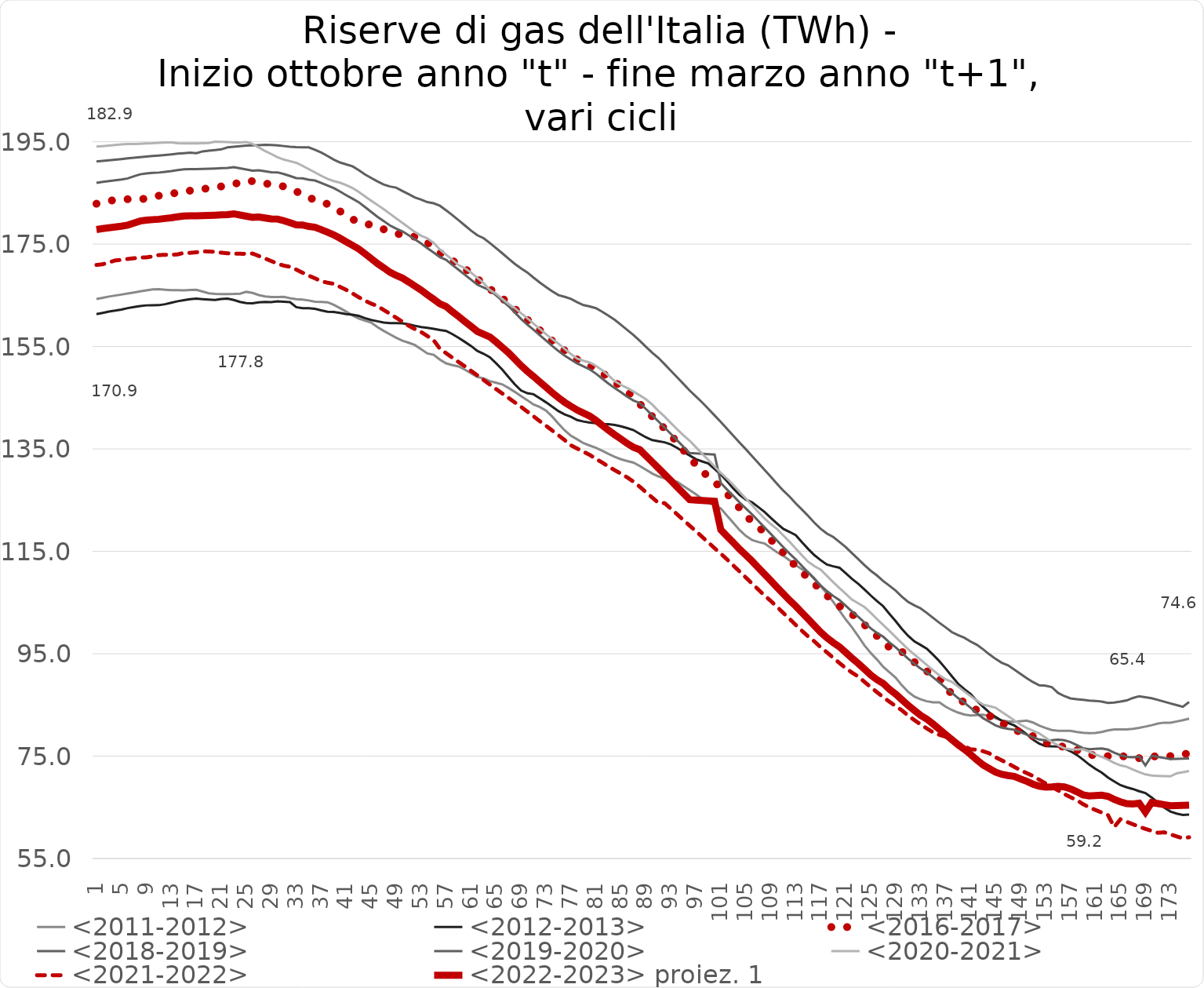
| Category | <2011-2012> | <2012-2013> | <2016-2017> | <2018-2019> | <2019-2020> | <2020-2021> | <2021-2022> | <2022-2023> proiez. 1 |
|---|---|---|---|---|---|---|---|---|
| 1.0 | 164.28 | 161.325 | 182.89 | 186.966 | 191.146 | 194.044 | 170.933 | 177.846 |
| 2.0 | 164.523 | 161.574 | 183.183 | 187.153 | 191.28 | 194.151 | 171.078 | 178.033 |
| 3.0 | 164.768 | 161.839 | 183.434 | 187.307 | 191.392 | 194.264 | 171.438 | 178.187 |
| 4.0 | 164.958 | 162.014 | 183.638 | 187.474 | 191.501 | 194.377 | 171.813 | 178.354 |
| 5.0 | 165.149 | 162.228 | 183.717 | 187.626 | 191.621 | 194.494 | 171.944 | 178.506 |
| 6.0 | 165.348 | 162.505 | 183.777 | 187.833 | 191.754 | 194.574 | 172.102 | 178.713 |
| 7.0 | 165.545 | 162.725 | 183.762 | 188.248 | 191.89 | 194.576 | 172.243 | 179.128 |
| 8.0 | 165.768 | 162.892 | 183.729 | 188.643 | 192 | 194.606 | 172.367 | 179.523 |
| 9.0 | 165.968 | 163.041 | 183.946 | 188.816 | 192.115 | 194.661 | 172.42 | 179.695 |
| 10.0 | 166.179 | 163.072 | 184.252 | 188.909 | 192.208 | 194.707 | 172.601 | 179.789 |
| 11.0 | 166.21 | 163.081 | 184.461 | 188.983 | 192.298 | 194.791 | 172.871 | 179.863 |
| 12.0 | 166.105 | 163.273 | 184.693 | 189.134 | 192.412 | 194.88 | 172.916 | 180.014 |
| 13.0 | 166.006 | 163.557 | 184.886 | 189.262 | 192.533 | 194.863 | 172.911 | 180.142 |
| 14.0 | 166.005 | 163.846 | 185.021 | 189.452 | 192.666 | 194.698 | 172.997 | 180.332 |
| 15.0 | 165.96 | 164.072 | 185.181 | 189.617 | 192.762 | 194.674 | 173.305 | 180.497 |
| 16.0 | 166.032 | 164.247 | 185.448 | 189.659 | 192.877 | 194.675 | 173.301 | 180.539 |
| 17.0 | 166.08 | 164.347 | 185.707 | 189.659 | 192.749 | 194.69 | 173.409 | 180.539 |
| 18.0 | 165.748 | 164.248 | 185.811 | 189.694 | 193.116 | 194.725 | 173.6 | 180.574 |
| 19.0 | 165.401 | 164.161 | 185.869 | 189.741 | 193.241 | 194.762 | 173.563 | 180.621 |
| 20.0 | 165.276 | 164.094 | 186.018 | 189.785 | 193.375 | 195.014 | 173.49 | 180.665 |
| 21.0 | 165.24 | 164.282 | 186.276 | 189.839 | 193.51 | 194.983 | 173.335 | 180.719 |
| 22.0 | 165.259 | 164.372 | 186.39 | 189.89 | 193.906 | 194.946 | 173.207 | 180.77 |
| 23.0 | 165.278 | 164.101 | 186.736 | 190.044 | 194.019 | 194.876 | 173.155 | 180.924 |
| 24.0 | 165.334 | 163.72 | 187.044 | 189.81 | 194.139 | 194.875 | 173.121 | 180.69 |
| 25.0 | 165.681 | 163.473 | 187.403 | 189.578 | 194.251 | 194.927 | 173.108 | 180.458 |
| 26.0 | 165.472 | 163.458 | 187.287 | 189.344 | 194.304 | 194.594 | 173.16 | 180.224 |
| 27.0 | 165.06 | 163.628 | 187.195 | 189.431 | 194.346 | 193.894 | 172.685 | 180.311 |
| 28.0 | 164.8 | 163.709 | 186.89 | 189.239 | 194.395 | 193.186 | 172.202 | 180.119 |
| 29.0 | 164.68 | 163.679 | 186.606 | 189.053 | 194.382 | 192.605 | 171.691 | 179.933 |
| 30.0 | 164.662 | 163.84 | 186.442 | 189.021 | 194.306 | 191.974 | 171.193 | 179.901 |
| 31.0 | 164.696 | 163.753 | 186.273 | 188.699 | 194.157 | 191.521 | 170.798 | 179.579 |
| 32.0 | 164.442 | 163.674 | 185.771 | 188.309 | 194.023 | 191.207 | 170.576 | 179.189 |
| 33.0 | 164.24 | 162.689 | 185.302 | 187.895 | 193.942 | 190.887 | 170.035 | 178.775 |
| 34.0 | 164.159 | 162.475 | 184.726 | 187.86 | 193.903 | 190.303 | 169.423 | 178.74 |
| 35.0 | 164.002 | 162.482 | 184.146 | 187.577 | 193.897 | 189.646 | 168.84 | 178.457 |
| 36.0 | 163.765 | 162.363 | 183.583 | 187.423 | 193.438 | 189.003 | 168.324 | 178.303 |
| 37.0 | 163.701 | 162.056 | 183.211 | 186.962 | 192.899 | 188.35 | 167.755 | 177.842 |
| 38.0 | 163.642 | 161.787 | 182.843 | 186.45 | 192.214 | 187.744 | 167.47 | 177.33 |
| 39.0 | 163.148 | 161.744 | 182.125 | 185.941 | 191.507 | 187.32 | 167.248 | 176.821 |
| 40.0 | 162.507 | 161.55 | 181.415 | 185.28 | 190.949 | 187.009 | 166.657 | 176.16 |
| 41.0 | 161.822 | 161.341 | 180.646 | 184.568 | 190.579 | 186.522 | 166.07 | 175.448 |
| 42.0 | 161.073 | 161.212 | 179.88 | 183.888 | 190.211 | 185.963 | 165.386 | 174.768 |
| 43.0 | 160.49 | 161.002 | 179.277 | 183.19 | 189.465 | 185.195 | 164.635 | 174.07 |
| 44.0 | 160.07 | 160.555 | 178.976 | 182.258 | 188.629 | 184.34 | 163.963 | 173.138 |
| 45.0 | 159.669 | 160.195 | 178.774 | 181.303 | 187.926 | 183.485 | 163.377 | 172.183 |
| 46.0 | 158.816 | 159.941 | 178.288 | 180.341 | 187.252 | 182.661 | 162.91 | 171.221 |
| 47.0 | 158.058 | 159.703 | 177.902 | 179.514 | 186.639 | 181.825 | 162.14 | 170.394 |
| 48.0 | 157.385 | 159.564 | 177.493 | 178.645 | 186.262 | 180.936 | 161.408 | 169.525 |
| 49.0 | 156.729 | 159.558 | 177.1 | 178.012 | 186.032 | 180.042 | 160.629 | 168.892 |
| 50.0 | 156.154 | 159.525 | 176.803 | 177.492 | 185.393 | 179.156 | 159.848 | 168.372 |
| 51.0 | 155.738 | 159.333 | 176.634 | 176.728 | 184.775 | 178.262 | 159.065 | 167.608 |
| 52.0 | 155.297 | 159.06 | 176.458 | 175.923 | 184.128 | 177.368 | 158.416 | 166.803 |
| 53.0 | 154.462 | 158.796 | 176.08 | 175.14 | 183.698 | 176.654 | 157.835 | 166.02 |
| 54.0 | 153.648 | 158.656 | 175.319 | 174.218 | 183.211 | 176.136 | 157.044 | 165.098 |
| 55.0 | 153.394 | 158.472 | 174.332 | 173.363 | 182.986 | 175.252 | 156.245 | 164.243 |
| 56.0 | 152.44 | 158.224 | 173.32 | 172.474 | 182.497 | 173.957 | 154.587 | 163.354 |
| 57.0 | 151.708 | 158.039 | 172.376 | 171.93 | 181.602 | 172.946 | 153.699 | 162.81 |
| 58.0 | 151.371 | 157.429 | 171.735 | 170.924 | 180.675 | 171.925 | 152.817 | 161.804 |
| 59.0 | 151.118 | 156.706 | 171.193 | 169.997 | 179.667 | 170.903 | 151.973 | 160.877 |
| 60.0 | 150.496 | 155.915 | 170.25 | 169.017 | 178.66 | 170.308 | 151.138 | 159.897 |
| 61.0 | 149.787 | 155.105 | 169.221 | 168.064 | 177.642 | 169.436 | 150.25 | 158.944 |
| 62.0 | 149.055 | 154.155 | 168.177 | 167.082 | 176.739 | 168.419 | 149.364 | 157.962 |
| 63.0 | 148.783 | 153.588 | 167.304 | 166.532 | 176.172 | 167.404 | 148.472 | 157.412 |
| 64.0 | 148.249 | 152.91 | 166.292 | 165.994 | 175.228 | 166.036 | 147.575 | 156.874 |
| 65.0 | 147.932 | 151.729 | 165.29 | 165.006 | 174.224 | 165.324 | 146.7 | 155.886 |
| 66.0 | 147.606 | 150.491 | 164.434 | 163.952 | 173.213 | 164.317 | 145.825 | 154.832 |
| 67.0 | 146.904 | 149.047 | 163.392 | 162.9 | 172.168 | 163.33 | 144.964 | 153.78 |
| 68.0 | 146.144 | 147.613 | 162.358 | 161.656 | 171.148 | 162.506 | 144.086 | 152.535 |
| 69.0 | 145.326 | 146.426 | 161.311 | 160.407 | 170.258 | 161.497 | 143.221 | 151.287 |
| 70.0 | 144.531 | 145.887 | 160.264 | 159.286 | 169.468 | 160.545 | 142.289 | 150.166 |
| 71.0 | 143.686 | 145.68 | 159.179 | 158.28 | 168.461 | 159.487 | 141.365 | 149.16 |
| 72.0 | 143.184 | 144.9 | 158.19 | 157.221 | 167.504 | 158.441 | 140.428 | 148.101 |
| 73.0 | 142.495 | 144.112 | 157.227 | 156.174 | 166.634 | 157.403 | 139.519 | 147.054 |
| 74.0 | 141.311 | 143.253 | 156.112 | 155.108 | 165.794 | 156.446 | 138.598 | 145.988 |
| 75.0 | 139.927 | 142.39 | 155.035 | 154.122 | 165.038 | 155.558 | 137.659 | 145.002 |
| 76.0 | 138.616 | 141.749 | 154.21 | 153.221 | 164.7 | 154.524 | 136.716 | 144.101 |
| 77.0 | 137.564 | 141.277 | 153.305 | 152.44 | 164.302 | 153.52 | 135.7 | 143.32 |
| 78.0 | 136.869 | 140.637 | 152.461 | 151.705 | 163.651 | 152.633 | 135.062 | 142.585 |
| 79.0 | 136.122 | 140.352 | 151.76 | 151.12 | 163.099 | 152.212 | 134.454 | 141.999 |
| 80.0 | 135.659 | 140.131 | 151.224 | 150.539 | 162.824 | 151.868 | 133.837 | 141.419 |
| 81.0 | 135.215 | 140.011 | 150.686 | 149.706 | 162.484 | 151.233 | 133.06 | 140.586 |
| 82.0 | 134.636 | 139.82 | 149.846 | 148.728 | 161.795 | 150.365 | 132.347 | 139.608 |
| 83.0 | 134.026 | 139.827 | 148.965 | 147.769 | 161.038 | 149.346 | 131.557 | 138.649 |
| 84.0 | 133.464 | 139.696 | 148.096 | 146.891 | 160.215 | 148.244 | 130.854 | 137.771 |
| 85.0 | 132.98 | 139.419 | 147.134 | 146.071 | 159.236 | 147.5 | 130.162 | 136.951 |
| 86.0 | 132.64 | 139.079 | 146.28 | 145.196 | 158.247 | 146.909 | 129.45 | 136.076 |
| 87.0 | 132.33 | 138.688 | 145.083 | 144.462 | 157.264 | 146.22 | 128.603 | 135.342 |
| 88.0 | 131.681 | 137.967 | 143.819 | 143.982 | 156.144 | 145.488 | 127.629 | 134.862 |
| 89.0 | 130.959 | 137.276 | 142.535 | 142.797 | 154.962 | 144.704 | 126.552 | 133.677 |
| 90.0 | 130.205 | 136.724 | 141.357 | 141.587 | 153.801 | 143.691 | 125.514 | 132.467 |
| 91.0 | 129.646 | 136.519 | 140.121 | 140.373 | 152.783 | 142.426 | 124.47 | 131.253 |
| 92.0 | 129.268 | 136.297 | 138.984 | 139.158 | 151.54 | 141.31 | 124.41 | 130.038 |
| 93.0 | 128.901 | 135.872 | 137.714 | 137.932 | 150.269 | 140.043 | 123.327 | 128.812 |
| 94.0 | 128.59 | 135.206 | 136.264 | 136.684 | 148.989 | 138.85 | 122.224 | 127.564 |
| 95.0 | 127.781 | 134.426 | 134.78 | 135.436 | 147.711 | 137.667 | 121.129 | 126.316 |
| 96.0 | 126.947 | 133.724 | 133.304 | 134.213 | 146.43 | 136.613 | 120.019 | 125.093 |
| 97.0 | 126.146 | 132.997 | 131.943 | 134.116 | 145.25 | 135.341 | 118.944 | 124.996 |
| 98.0 | 125.26 | 132.563 | 130.715 | 134.042 | 144.095 | 134.071 | 117.832 | 124.922 |
| 99.0 | 124.481 | 132.156 | 129.536 | 133.992 | 142.825 | 132.838 | 116.724 | 124.872 |
| 100.0 | 123.978 | 131.066 | 128.514 | 133.898 | 141.542 | 131.573 | 115.612 | 124.778 |
| 101.0 | 123.371 | 129.99 | 127.447 | 128.326 | 140.272 | 130.308 | 114.538 | 119.206 |
| 102.0 | 121.942 | 128.678 | 126.269 | 127.056 | 138.918 | 129.185 | 113.414 | 117.936 |
| 103.0 | 120.548 | 127.289 | 124.79 | 125.826 | 137.56 | 127.96 | 112.235 | 116.706 |
| 104.0 | 119.158 | 126.034 | 123.45 | 124.551 | 136.229 | 126.62 | 111.066 | 115.431 |
| 105.0 | 118.024 | 125.088 | 122.039 | 123.387 | 134.953 | 125.311 | 109.89 | 114.267 |
| 106.0 | 117.22 | 124.596 | 120.786 | 122.209 | 133.597 | 123.998 | 108.709 | 113.089 |
| 107.0 | 116.828 | 123.647 | 119.751 | 120.946 | 132.242 | 122.658 | 107.535 | 111.826 |
| 108.0 | 116.537 | 122.696 | 118.698 | 119.665 | 130.905 | 121.416 | 106.374 | 110.545 |
| 109.0 | 115.679 | 121.535 | 117.288 | 118.395 | 129.553 | 120.334 | 105.306 | 109.275 |
| 110.0 | 114.825 | 120.446 | 116.044 | 117.106 | 128.189 | 119.375 | 104.146 | 107.986 |
| 111.0 | 114.112 | 119.39 | 114.753 | 115.823 | 126.855 | 118.113 | 102.969 | 106.703 |
| 112.0 | 113.241 | 118.797 | 113.401 | 114.577 | 125.695 | 116.871 | 101.806 | 105.457 |
| 113.0 | 112.302 | 118.155 | 112.06 | 113.423 | 124.346 | 115.531 | 100.629 | 104.303 |
| 114.0 | 111.5 | 116.77 | 110.897 | 112.137 | 123.15 | 114.198 | 99.469 | 103.017 |
| 115.0 | 110.894 | 115.448 | 109.837 | 110.875 | 121.904 | 112.944 | 98.365 | 101.755 |
| 116.0 | 109.73 | 114.241 | 108.664 | 109.587 | 120.565 | 112.082 | 97.384 | 100.467 |
| 117.0 | 108.188 | 113.268 | 107.456 | 108.318 | 119.396 | 111.411 | 96.259 | 99.198 |
| 118.0 | 106.711 | 112.411 | 106.353 | 107.228 | 118.46 | 110.19 | 95.256 | 98.108 |
| 119.0 | 105.132 | 112.08 | 105.28 | 106.291 | 117.798 | 108.964 | 94.214 | 97.171 |
| 120.0 | 103.42 | 111.801 | 104.305 | 105.469 | 116.821 | 107.831 | 93.178 | 96.349 |
| 121.0 | 101.706 | 110.732 | 103.5 | 104.371 | 115.839 | 106.702 | 92.19 | 95.251 |
| 122.0 | 100.163 | 109.634 | 102.744 | 103.272 | 114.636 | 105.569 | 91.314 | 94.152 |
| 123.0 | 98.419 | 108.676 | 101.681 | 102.215 | 113.498 | 104.854 | 90.544 | 93.095 |
| 124.0 | 96.634 | 107.558 | 100.651 | 101.106 | 112.299 | 104.141 | 89.513 | 91.986 |
| 125.0 | 95.161 | 106.385 | 99.582 | 99.964 | 111.218 | 102.984 | 88.476 | 90.844 |
| 126.0 | 93.878 | 105.309 | 98.473 | 99.057 | 110.292 | 101.784 | 87.49 | 89.937 |
| 127.0 | 92.453 | 104.288 | 97.332 | 98.329 | 109.201 | 100.609 | 86.522 | 89.209 |
| 128.0 | 91.396 | 102.788 | 96.237 | 97.198 | 108.275 | 99.46 | 85.626 | 88.078 |
| 129.0 | 90.328 | 101.374 | 95.416 | 96.255 | 107.33 | 98.249 | 84.77 | 87.135 |
| 130.0 | 88.823 | 99.838 | 95.401 | 95.142 | 106.149 | 97.051 | 83.946 | 86.021 |
| 131.0 | 87.559 | 98.495 | 94.34 | 94.03 | 105.12 | 95.868 | 82.911 | 84.91 |
| 132.0 | 86.621 | 97.4 | 93.37 | 93.044 | 104.443 | 94.844 | 82.035 | 83.924 |
| 133.0 | 86.094 | 96.704 | 92.499 | 92.091 | 103.864 | 93.818 | 81.181 | 82.971 |
| 134.0 | 85.708 | 95.982 | 91.582 | 91.352 | 102.964 | 92.793 | 80.402 | 82.232 |
| 135.0 | 85.493 | 94.792 | 90.928 | 90.386 | 101.992 | 91.767 | 79.639 | 81.266 |
| 136.0 | 85.492 | 93.544 | 90.273 | 89.382 | 101.04 | 90.783 | 79.162 | 80.262 |
| 137.0 | 84.663 | 92.111 | 88.236 | 88.35 | 100.156 | 90.009 | 78.788 | 79.23 |
| 138.0 | 84.01 | 90.598 | 87.235 | 87.351 | 99.22 | 89.504 | 78.14 | 78.231 |
| 139.0 | 83.504 | 89.135 | 86.347 | 86.335 | 98.613 | 88.587 | 77.528 | 77.215 |
| 140.0 | 83.13 | 88.077 | 85.439 | 85.453 | 98.115 | 87.634 | 76.935 | 76.333 |
| 141.0 | 82.929 | 87.119 | 84.504 | 84.451 | 97.381 | 86.72 | 76.321 | 75.331 |
| 142.0 | 82.999 | 85.819 | 84.01 | 83.378 | 96.752 | 85.835 | 76.254 | 74.258 |
| 143.0 | 83.099 | 84.631 | 83.658 | 82.412 | 95.871 | 85.064 | 75.96 | 73.292 |
| 144.0 | 82.843 | 83.519 | 82.895 | 81.7 | 94.883 | 84.77 | 75.546 | 72.58 |
| 145.0 | 82.396 | 82.649 | 82.074 | 80.993 | 93.991 | 84.449 | 74.779 | 71.873 |
| 146.0 | 81.971 | 81.905 | 81.471 | 80.567 | 93.221 | 83.626 | 74.172 | 71.447 |
| 147.0 | 81.79 | 81.46 | 80.798 | 80.335 | 92.734 | 82.807 | 73.564 | 71.215 |
| 148.0 | 81.696 | 80.99 | 80.109 | 80.162 | 91.907 | 81.993 | 72.896 | 71.042 |
| 149.0 | 81.813 | 80.18 | 79.725 | 79.665 | 91.055 | 81.173 | 72.236 | 70.545 |
| 150.0 | 81.924 | 79.264 | 79.42 | 79.19 | 90.202 | 80.49 | 71.677 | 70.07 |
| 151.0 | 81.556 | 78.197 | 78.875 | 78.648 | 89.46 | 79.959 | 71.113 | 69.527 |
| 152.0 | 80.955 | 77.449 | 78.25 | 78.246 | 88.822 | 79.446 | 70.396 | 69.126 |
| 153.0 | 80.508 | 76.972 | 77.684 | 78.078 | 88.764 | 78.597 | 69.676 | 68.958 |
| 154.0 | 80.109 | 76.916 | 77.235 | 78.092 | 88.487 | 77.754 | 68.959 | 68.972 |
| 155.0 | 79.942 | 76.89 | 76.931 | 78.223 | 87.348 | 77.125 | 68.318 | 69.103 |
| 156.0 | 79.942 | 76.503 | 76.843 | 78.1 | 86.73 | 76.536 | 67.6 | 68.98 |
| 157.0 | 79.942 | 75.956 | 76.758 | 77.746 | 86.269 | 76.318 | 66.974 | 68.626 |
| 158.0 | 79.711 | 75.247 | 76.226 | 77.179 | 86.117 | 76.322 | 66.428 | 68.059 |
| 159.0 | 79.573 | 74.341 | 75.738 | 76.555 | 85.987 | 76.331 | 65.624 | 67.435 |
| 160.0 | 79.491 | 73.348 | 75.342 | 76.348 | 85.853 | 75.852 | 65.002 | 67.228 |
| 161.0 | 79.534 | 72.522 | 75.069 | 76.428 | 85.789 | 75.326 | 64.481 | 67.307 |
| 162.0 | 79.704 | 71.79 | 74.843 | 76.482 | 85.656 | 74.853 | 63.977 | 67.362 |
| 163.0 | 80.014 | 70.82 | 74.991 | 76.261 | 85.403 | 74.314 | 63.49 | 67.141 |
| 164.0 | 80.225 | 70.071 | 75.182 | 75.678 | 85.46 | 73.68 | 61.152 | 66.558 |
| 165.0 | 80.225 | 69.337 | 75.043 | 75.2 | 85.652 | 73.195 | 62.66 | 66.08 |
| 166.0 | 80.198 | 68.909 | 74.87 | 74.848 | 85.878 | 72.916 | 62.172 | 65.728 |
| 167.0 | 80.332 | 68.573 | 74.707 | 74.783 | 86.356 | 72.395 | 61.689 | 65.663 |
| 168.0 | 80.534 | 68.148 | 74.602 | 74.935 | 86.702 | 71.872 | 61.212 | 65.815 |
| 169.0 | 80.765 | 67.783 | 74.576 | 73.199 | 86.5 | 71.431 | 60.787 | 64.079 |
| 170.0 | 81.037 | 66.933 | 74.808 | 75.064 | 86.3 | 71.201 | 60.402 | 65.944 |
| 171.0 | 81.371 | 65.937 | 75.092 | 74.856 | 85.985 | 71.135 | 60.022 | 65.736 |
| 172.0 | 81.535 | 64.963 | 75.086 | 74.638 | 85.629 | 71.096 | 60.119 | 65.518 |
| 173.0 | 81.505 | 64.177 | 75.005 | 74.442 | 85.298 | 71.057 | 59.724 | 65.322 |
| 174.0 | 81.77 | 63.776 | 75.069 | 74.464 | 84.972 | 71.632 | 59.321 | 65.344 |
| 175.0 | 82.019 | 63.516 | 75.253 | 74.51 | 84.646 | 71.85 | 58.945 | 65.39 |
| 176.0 | 82.326 | 63.591 | 75.645 | 74.557 | 85.57 | 72.098 | 59.16 | 65.437 |